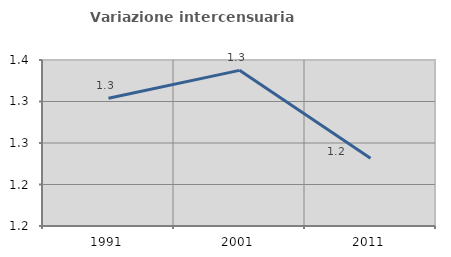
| Category | Variazione intercensuaria annua |
|---|---|
| 1991.0 | 1.304 |
| 2001.0 | 1.338 |
| 2011.0 | 1.232 |